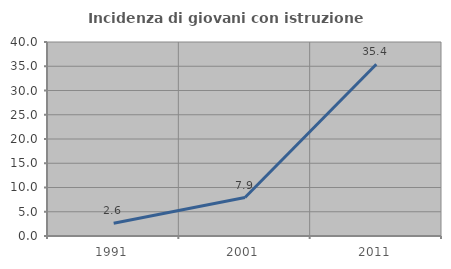
| Category | Incidenza di giovani con istruzione universitaria |
|---|---|
| 1991.0 | 2.632 |
| 2001.0 | 7.937 |
| 2011.0 | 35.417 |